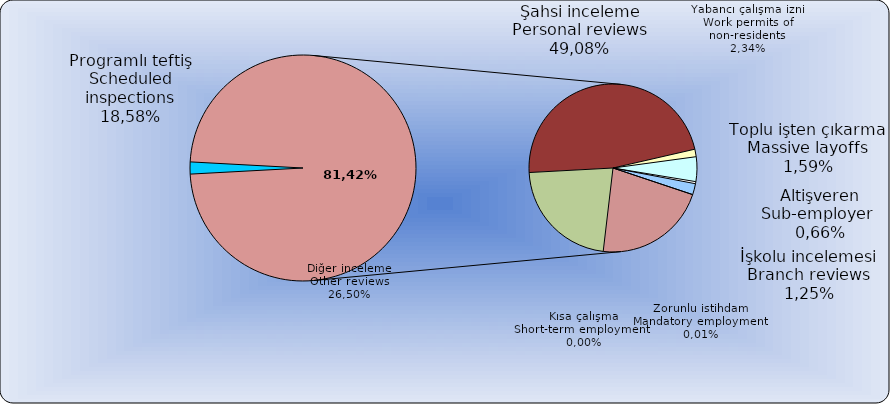
| Category | Series 0 |
|---|---|
| Programlı teftiş
Scheduled inspections | 148 |
| Şahsi inceleme
Personal reviews | 3991 |
| Yabancı çalışma izni
Work permits of non-residents | 122 |
| Toplu işten çıkarma
Massive layoffs | 401 |
| Altişveren
Sub-employer  | 34 |
| İşkolu incelemesi
Branch reviews | 179 |
| Zorunlu istihdam
Mandatory employment | 2 |
| Kısa çalışma şikayet
Short-term employment complaints  | 1834 |
| Diğer inceleme (*)
Other reviews | 1881 |